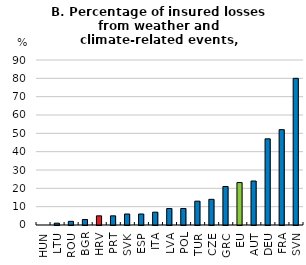
| Category | Insured losses (%) |
|---|---|
| HUN | 0 |
| LTU | 1 |
| ROU | 2 |
| BGR | 3 |
| HRV | 5 |
| PRT | 5 |
| SVK | 6 |
| ESP | 6 |
| ITA | 7 |
| LVA | 9 |
| POL | 9 |
| TUR | 13 |
| CZE | 14 |
| GRC | 21 |
| EU | 23.148 |
| AUT | 24 |
| DEU | 47 |
| FRA | 52 |
| SVN | 80 |